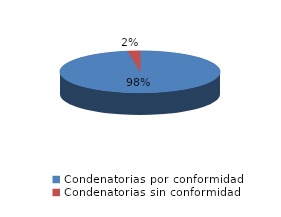
| Category | Series 0 |
|---|---|
| 0 | 518 |
| 1 | 13 |